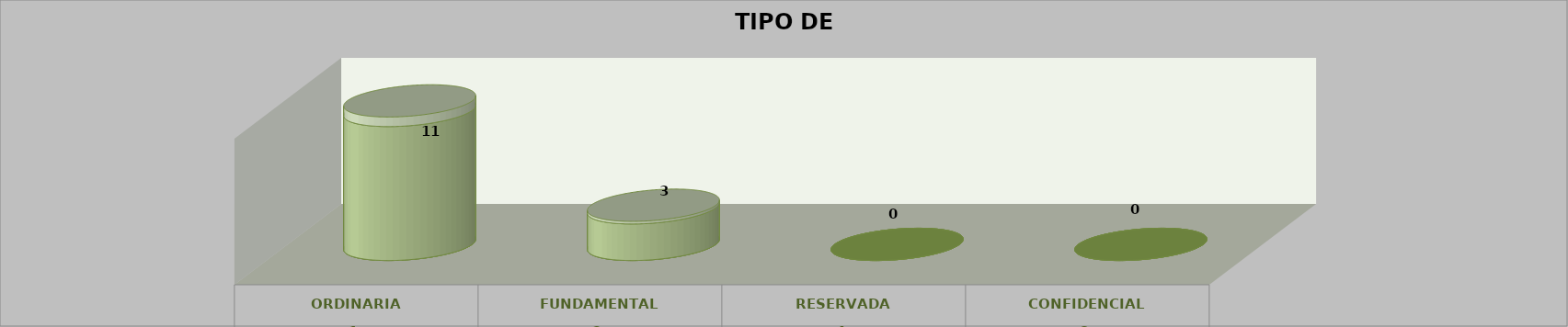
| Category | Series 0 | Series 2 | Series 1 | Series 3 | Series 4 |
|---|---|---|---|---|---|
| 0 |  |  |  | 11 | 0.786 |
| 1 |  |  |  | 3 | 0.214 |
| 2 |  |  |  | 0 | 0 |
| 3 |  |  |  | 0 | 0 |